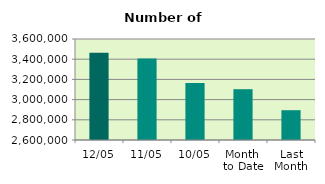
| Category | Series 0 |
|---|---|
| 12/05 | 3463736 |
| 11/05 | 3406468 |
| 10/05 | 3163882 |
| Month 
to Date | 3103004.222 |
| Last
Month | 2895009.158 |